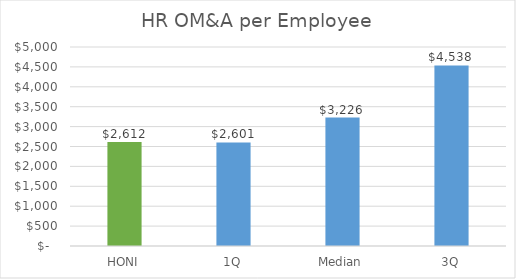
| Category | HR OM&A per Employee |
|---|---|
| HONI | 2612.476 |
| 1Q | 2601.046 |
| Median | 3225.728 |
| 3Q | 4537.523 |